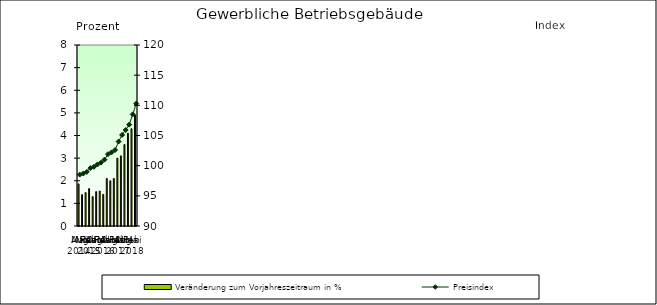
| Category | Veränderung zum Vorjahreszeitraum in % |
|---|---|
| 0 | 1.86 |
| 1 | 1.386 |
| 2 | 1.476 |
| 3 | 1.653 |
| 4 | 1.299 |
| 5 | 1.519 |
| 6 | 1.546 |
| 7 | 1.4 |
| 8 | 2.1 |
| 9 | 2 |
| 10 | 2.1 |
| 11 | 3 |
| 12 | 3.1 |
| 13 | 3.6 |
| 14 | 4.1 |
| 15 | 4.3 |
| 16 | 4.9 |